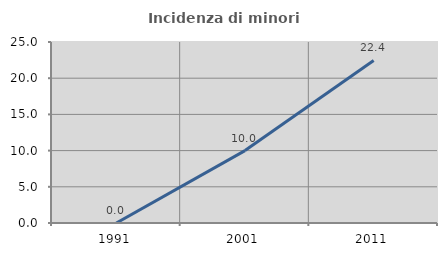
| Category | Incidenza di minori stranieri |
|---|---|
| 1991.0 | 0 |
| 2001.0 | 10 |
| 2011.0 | 22.449 |